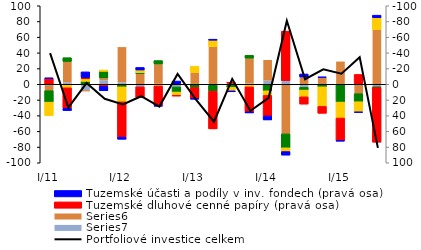
| Category | Series 6 | Series 5 | Zahraniční účasti a podíly v investičních fondech   | Zahraniční dluhové cenné papíry   |
|---|---|---|---|---|
| I/11 | 0.812 | 7.345 | 14.567 | 17.185 |
| II | -2.914 | -26.084 | -4.896 | 4.506 |
| III | 7.125 | 1.717 | -3.713 | -3.275 |
| IV | -5.325 | -2.798 | -8.33 | -1.701 |
| I/12 | -2.798 | -44.867 | 3.306 | 19.066 |
| II | 3.249 | -13.669 | -1.1 | -3.438 |
| III | -0.915 | -24.887 | -4.429 | 2.169 |
| IV | 3.402 | -0.733 | 6.453 | 4.343 |
| I/13 | -0.714 | -14.146 | 4.078 | -8.168 |
| II | 1.279 | -48.104 | 7.436 | -8.051 |
| III | -1.224 | 1.376 | 2.417 | 4.579 |
| IV | -1.402 | -31.82 | -3.652 | 3.278 |
| I/14 | -5.024 | -26.183 | 8.294 | 5.918 |
| II | -4.546 | 63.167 | 17.782 | 4.744 |
| III | 3.872 | -9.272 | 3.481 | 8.634 |
| IV | 0.485 | -8.788 | 2.772 | 24.934 |
| I/15 | -0.202 | -29.014 | 22.663 | 20.346 |
| II | -0.554 | 11.971 | 10.252 | 13.092 |